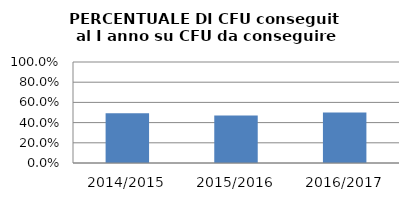
| Category | 2014/2015 2015/2016 2016/2017 |
|---|---|
| 2014/2015 | 0.493 |
| 2015/2016 | 0.47 |
| 2016/2017 | 0.499 |